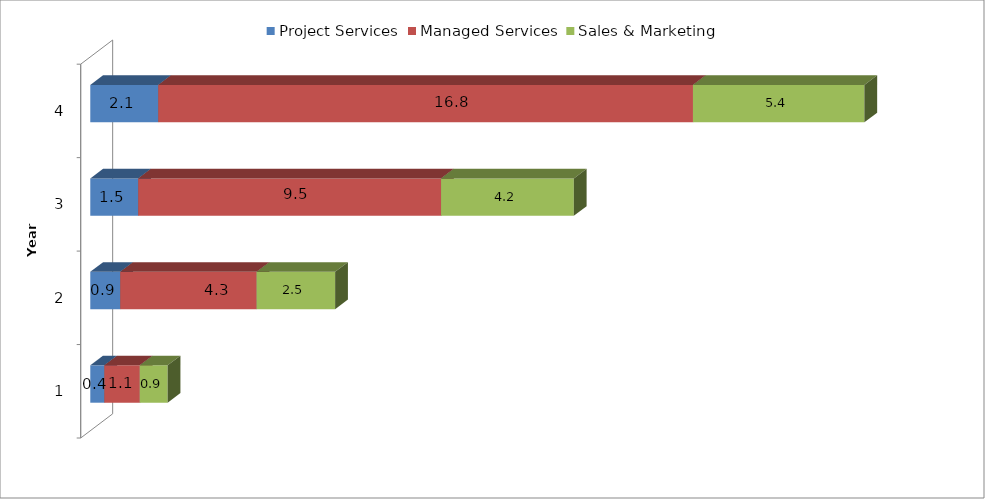
| Category | Project Services | Managed Services | Sales & Marketing |
|---|---|---|---|
| 1.0 | 0.443 | 1.117 | 0.876 |
| 2.0 | 0.944 | 4.297 | 2.472 |
| 3.0 | 1.51 | 9.539 | 4.183 |
| 4.0 | 2.141 | 16.844 | 5.399 |